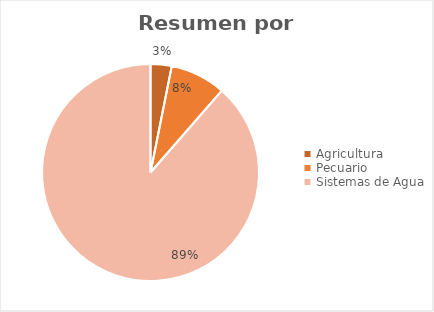
| Category | Series 0 | Series 1 |
|---|---|---|
| Agricultura | 1071479883.542 | 0.031 |
| Pecuario | 2821086086.16 | 0.083 |
| Sistemas de Agua | 30226362429.253 | 0.886 |